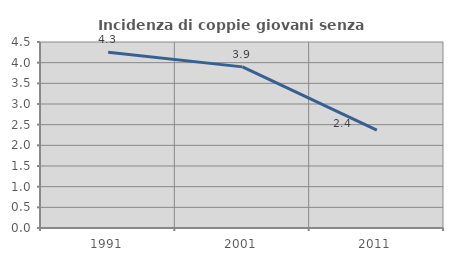
| Category | Incidenza di coppie giovani senza figli |
|---|---|
| 1991.0 | 4.253 |
| 2001.0 | 3.898 |
| 2011.0 | 2.368 |